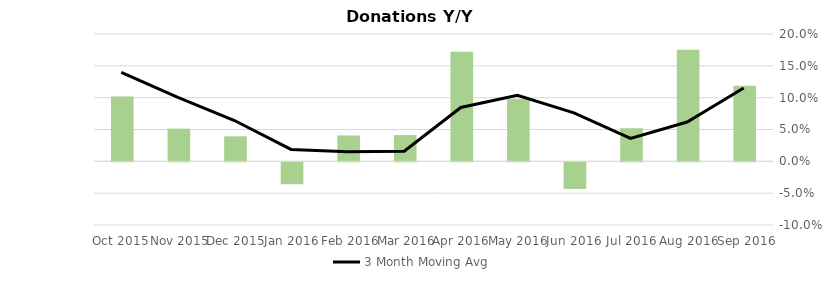
| Category | Donation Index Amount Y/Y Growth |
|---|---|
| Sep 2016 | 0.119 |
| Aug 2016 | 0.175 |
| Jul 2016 | 0.052 |
| Jun 2016 | -0.042 |
| May 2016 | 0.098 |
| Apr 2016 | 0.172 |
| Mar 2016 | 0.041 |
| Feb 2016 | 0.041 |
| Jan 2016 | -0.034 |
| Dec 2015 | 0.039 |
| Nov 2015 | 0.051 |
| Oct 2015 | 0.102 |